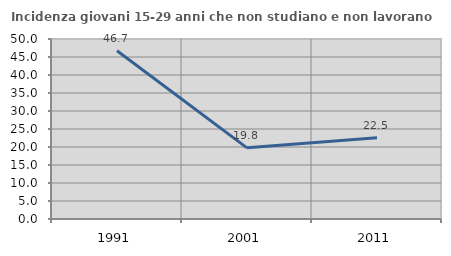
| Category | Incidenza giovani 15-29 anni che non studiano e non lavorano  |
|---|---|
| 1991.0 | 46.727 |
| 2001.0 | 19.767 |
| 2011.0 | 22.549 |